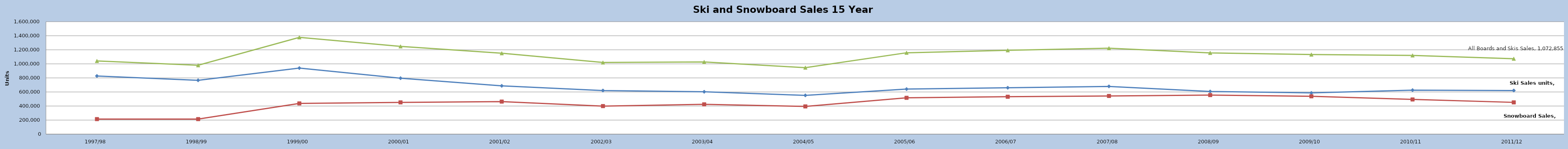
| Category | Ski Sales units | Snowboard Sales | All Boards and Skis Sales |
|---|---|---|---|
| 1997/98 | 827000 | 214000 | 1041000 |
| 1998/99 | 766000 | 214000 | 980000 |
| 1999/00 | 939999 | 437202 | 1377201 |
| 2000/01 | 796206 | 452073 | 1248279 |
| 2001/02 | 687440 | 463485 | 1150925 |
| 2002/03 | 620676 | 398787 | 1019463 |
| 2003/04 | 602814 | 424301 | 1027115 |
| 2004/05 | 551854 | 394453 | 946307 |
| 2005/06 | 640854 | 516932 | 1157786 |
| 2006/07 | 659920 | 532472 | 1192392 |
| 2007/08 | 679258 | 543403 | 1222661 |
| 2008/09 | 606979 | 556055 | 1156138 |
| 2009/10 | 586468 | 538722 | 1132288 |
| 2010/11 | 626238 | 493600 | 1119838 |
| 2011/12 | 620710 | 452145 | 1072855 |